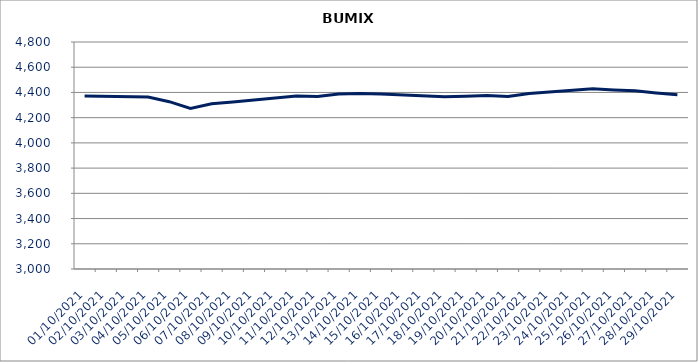
| Category | BUMIX |
|---|---|
| 01/10/2021 | 4372.74 |
| 04/10/2021 | 4362.94 |
| 05/10/2021 | 4326.82 |
| 06/10/2021 | 4273.07 |
| 07/10/2021 | 4310.14 |
| 08/10/2021 | 4325.13 |
| 11/10/2021 | 4371.07 |
| 12/10/2021 | 4368.19 |
| 13/10/2021 | 4388.26 |
| 14/10/2021 | 4392.24 |
| 15/10/2021 | 4387.15 |
| 18/10/2021 | 4366.68 |
| 19/10/2021 | 4370.65 |
| 20/10/2021 | 4375.2 |
| 21/10/2021 | 4367.75 |
| 22/10/2021 | 4392.46 |
| 25/10/2021 | 4428.31 |
| 26/10/2021 | 4419.51 |
| 27/10/2021 | 4414.15 |
| 28/10/2021 | 4396.35 |
| 29/10/2021 | 4381.14 |